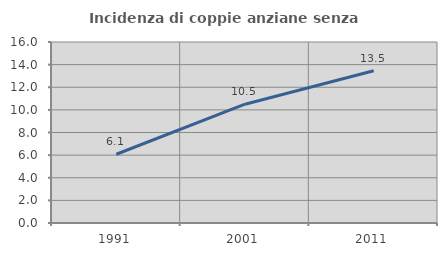
| Category | Incidenza di coppie anziane senza figli  |
|---|---|
| 1991.0 | 6.077 |
| 2001.0 | 10.5 |
| 2011.0 | 13.453 |